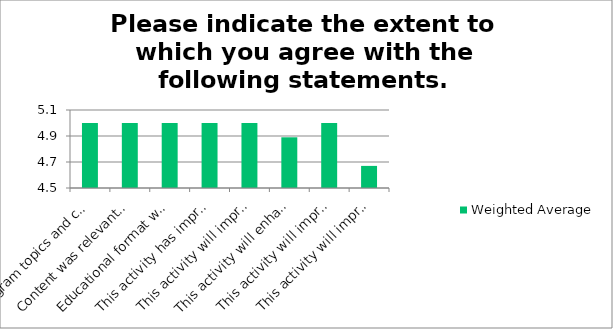
| Category | Weighted Average |
|---|---|
| Program topics and content met the stated objectives. | 5 |
| Content was relevant to my educational needs. | 5 |
| Educational format was conducive to learning. | 5 |
| This activity has improved my competence. | 5 |
| This activity will improve my performance. | 5 |
| This activity will enhance my communication skills. | 4.89 |
| This activity will improve patient outcomes. | 5 |
| This activity will improve processes of care and/or healthcare system performance. | 4.67 |